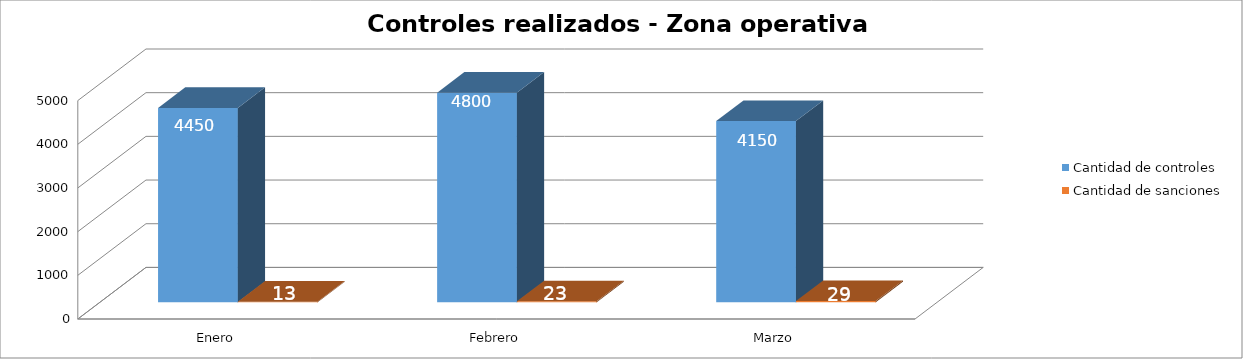
| Category | Cantidad de controles | Cantidad de sanciones |
|---|---|---|
| Enero | 4450 | 13 |
| Febrero | 4800 | 23 |
| Marzo | 4150 | 29 |